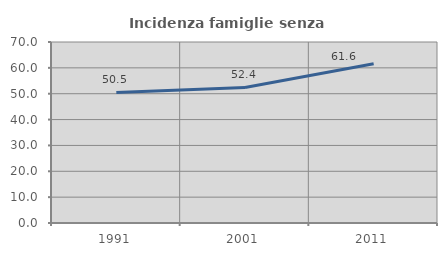
| Category | Incidenza famiglie senza nuclei |
|---|---|
| 1991.0 | 50.505 |
| 2001.0 | 52.423 |
| 2011.0 | 61.613 |